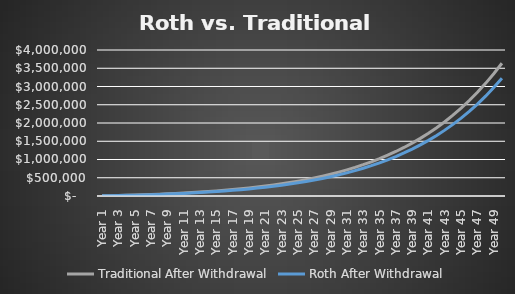
| Category | Traditional | Roth |
|---|---|---|
| Year 1 | 4276.8 | 3790.8 |
| Year 2 | 9024.048 | 7998.588 |
| Year 3 | 14283.229 | 12660.135 |
| Year 4 | 20099.262 | 17815.255 |
| Year 5 | 26520.779 | 23507.054 |
| Year 6 | 33600.425 | 29782.195 |
| Year 7 | 41395.182 | 36691.184 |
| Year 8 | 49966.721 | 44288.684 |
| Year 9 | 59381.781 | 52633.851 |
| Year 10 | 69712.577 | 61790.693 |
| Year 11 | 81037.245 | 71828.467 |
| Year 12 | 93440.316 | 82822.098 |
| Year 13 | 107013.235 | 94852.64 |
| Year 14 | 121854.919 | 108007.769 |
| Year 15 | 138072.356 | 122382.316 |
| Year 16 | 155781.26 | 138078.844 |
| Year 17 | 175106.769 | 155208.273 |
| Year 18 | 196184.21 | 173890.549 |
| Year 19 | 219159.912 | 194255.377 |
| Year 20 | 244192.1 | 216442.997 |
| Year 21 | 271451.844 | 240605.044 |
| Year 22 | 301124.1 | 266905.452 |
| Year 23 | 333408.819 | 295521.453 |
| Year 24 | 368522.159 | 326644.641 |
| Year 25 | 406697.785 | 360482.128 |
| Year 26 | 448188.278 | 397257.792 |
| Year 27 | 493266.649 | 437213.621 |
| Year 28 | 542227.99 | 480611.173 |
| Year 29 | 595391.238 | 527733.143 |
| Year 30 | 653101.097 | 578885.063 |
| Year 31 | 715730.101 | 634397.135 |
| Year 32 | 783680.853 | 694626.21 |
| Year 33 | 857388.435 | 759957.931 |
| Year 34 | 937323.017 | 830809.038 |
| Year 35 | 1023992.671 | 907629.867 |
| Year 36 | 1117946.411 | 990907.046 |
| Year 37 | 1219777.481 | 1081166.404 |
| Year 38 | 1330126.897 | 1178976.113 |
| Year 39 | 1449687.283 | 1284950.091 |
| Year 40 | 1579207.006 | 1399751.665 |
| Year 41 | 1719494.65 | 1524097.531 |
| Year 42 | 1871423.838 | 1658762.038 |
| Year 43 | 2035938.449 | 1804581.807 |
| Year 44 | 2214058.25 | 1962460.722 |
| Year 45 | 2406884.977 | 2133375.321 |
| Year 46 | 2615608.904 | 2318380.62 |
| Year 47 | 2841515.94 | 2518616.401 |
| Year 48 | 3085995.288 | 2735314.005 |
| Year 49 | 3350547.725 | 2969803.666 |
| Year 50 | 3636794.543 | 3223522.436 |